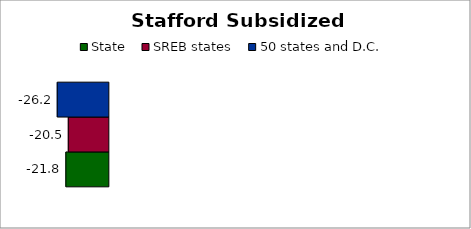
| Category | State | SREB states | 50 states and D.C. |
|---|---|---|---|
| 0 | -21.763 | -20.517 | -26.182 |